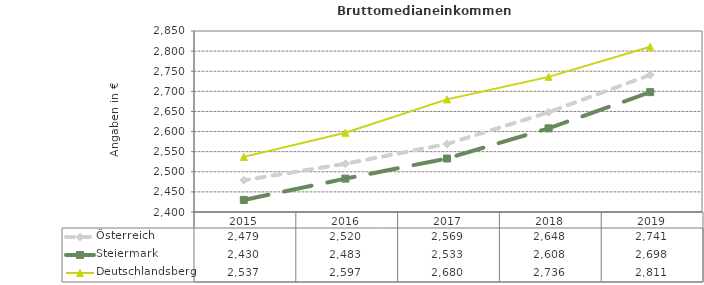
| Category | Österreich | Steiermark | Deutschlandsberg |
|---|---|---|---|
| 2019.0 | 2741 | 2698 | 2811 |
| 2018.0 | 2648 | 2608 | 2736 |
| 2017.0 | 2569 | 2533 | 2680 |
| 2016.0 | 2520 | 2483 | 2597 |
| 2015.0 | 2479 | 2430 | 2537 |